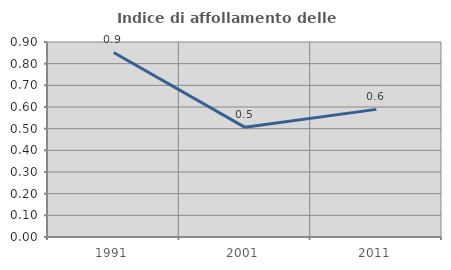
| Category | Indice di affollamento delle abitazioni  |
|---|---|
| 1991.0 | 0.852 |
| 2001.0 | 0.506 |
| 2011.0 | 0.589 |